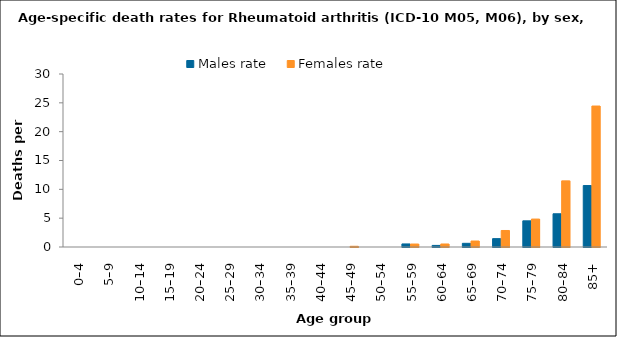
| Category | Males rate | Females rate |
|---|---|---|
| 0–4 | 0 | 0 |
| 5–9 | 0 | 0 |
| 10–14 | 0 | 0 |
| 15–19 | 0 | 0 |
| 20–24 | 0 | 0 |
| 25–29 | 0 | 0 |
| 30–34 | 0 | 0 |
| 35–39 | 0 | 0 |
| 40–44 | 0 | 0 |
| 45–49 | 0 | 0.122 |
| 50–54 | 0 | 0 |
| 55–59 | 0.53 | 0.513 |
| 60–64 | 0.276 | 0.522 |
| 65–69 | 0.638 | 1.036 |
| 70–74 | 1.451 | 2.863 |
| 75–79 | 4.538 | 4.844 |
| 80–84 | 5.763 | 11.468 |
| 85+ | 10.657 | 24.445 |